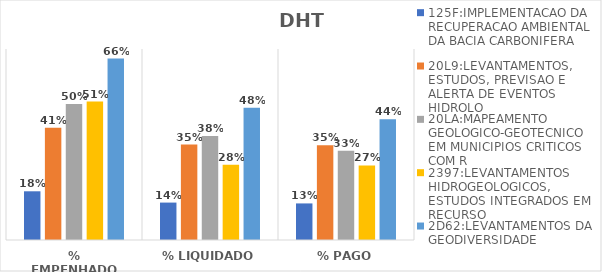
| Category | 125F:IMPLEMENTACAO DA RECUPERACAO AMBIENTAL DA BACIA CARBONIFERA | 20L9:LEVANTAMENTOS, ESTUDOS, PREVISAO E ALERTA DE EVENTOS HIDROLO | 20LA:MAPEAMENTO GEOLOGICO-GEOTECNICO EM MUNICIPIOS CRITICOS COM R | 2397:LEVANTAMENTOS HIDROGEOLOGICOS, ESTUDOS INTEGRADOS EM RECURSO | 2D62:LEVANTAMENTOS DA GEODIVERSIDADE |
|---|---|---|---|---|---|
| % EMPENHADO | 0.179 | 0.411 | 0.499 | 0.507 | 0.665 |
| % LIQUIDADO | 0.137 | 0.35 | 0.381 | 0.276 | 0.485 |
| % PAGO | 0.134 | 0.347 | 0.327 | 0.273 | 0.442 |